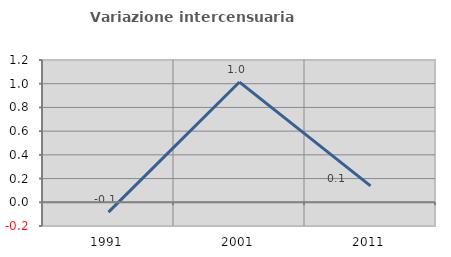
| Category | Variazione intercensuaria annua |
|---|---|
| 1991.0 | -0.083 |
| 2001.0 | 1.014 |
| 2011.0 | 0.138 |